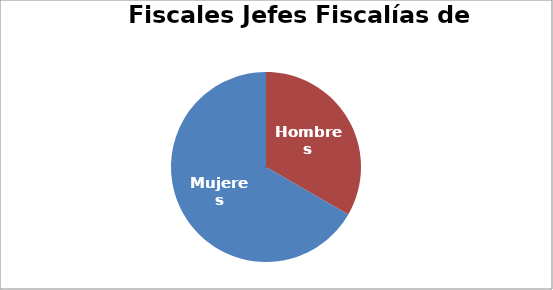
| Category | Fiscales Jefes de Fiscalías de Área  |
|---|---|
| Hombres | 9 |
| Mujeres | 18 |